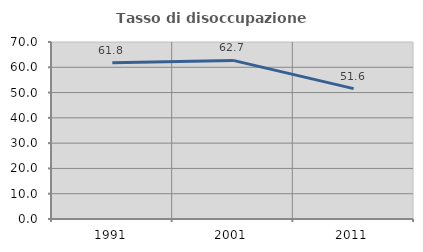
| Category | Tasso di disoccupazione giovanile  |
|---|---|
| 1991.0 | 61.836 |
| 2001.0 | 62.718 |
| 2011.0 | 51.575 |